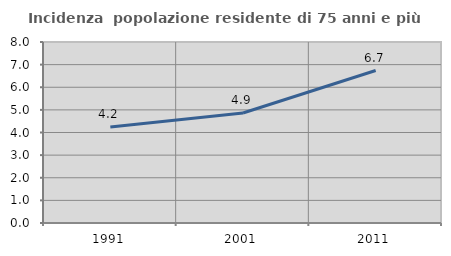
| Category | Incidenza  popolazione residente di 75 anni e più |
|---|---|
| 1991.0 | 4.246 |
| 2001.0 | 4.861 |
| 2011.0 | 6.739 |